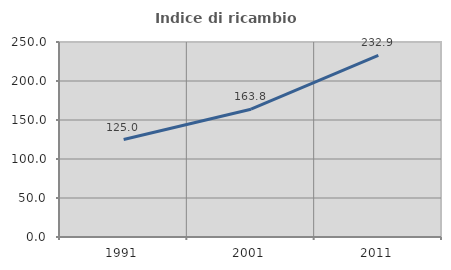
| Category | Indice di ricambio occupazionale  |
|---|---|
| 1991.0 | 125 |
| 2001.0 | 163.804 |
| 2011.0 | 232.867 |